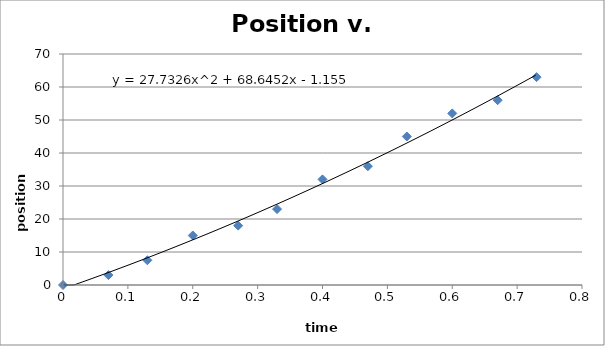
| Category | Series 0 |
|---|---|
| 0.0 | 0 |
| 0.07 | 3 |
| 0.13 | 7.5 |
| 0.2 | 15 |
| 0.27 | 18 |
| 0.33 | 23 |
| 0.4 | 32 |
| 0.47 | 36 |
| 0.53 | 45 |
| 0.6 | 52 |
| 0.67 | 56 |
| 0.73 | 63 |